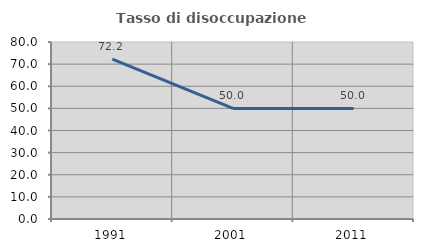
| Category | Tasso di disoccupazione giovanile  |
|---|---|
| 1991.0 | 72.222 |
| 2001.0 | 50 |
| 2011.0 | 50 |